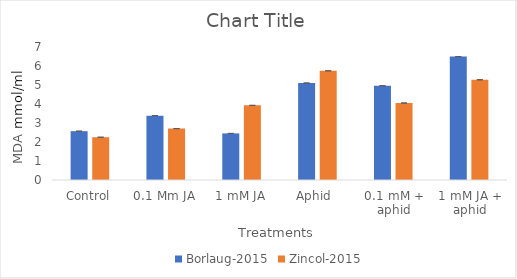
| Category | Borlaug-2015 | Zincol-2015 |
|---|---|---|
| Control | 2.57 | 2.252 |
| 0.1 Mm JA | 3.387 | 2.705 |
| 1 mM JA | 2.452 | 3.929 |
| Aphid  | 5.103 | 5.746 |
| 0.1 mM + aphid | 4.961 | 4.052 |
| 1 mM JA + aphid | 6.495 | 5.273 |